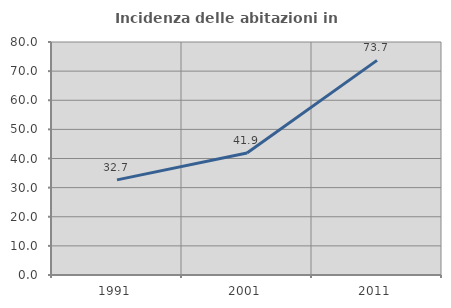
| Category | Incidenza delle abitazioni in proprietà  |
|---|---|
| 1991.0 | 32.67 |
| 2001.0 | 41.875 |
| 2011.0 | 73.688 |